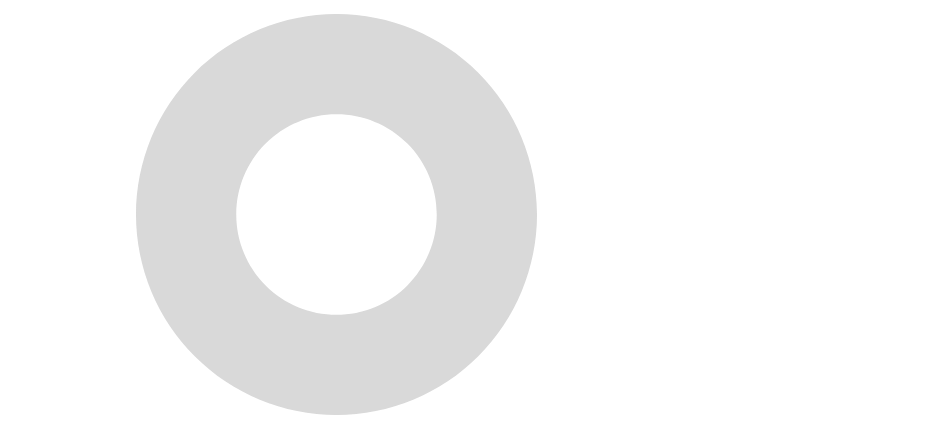
| Category | Series 0 |
|---|---|
| # of YES | 0 |
| # of NO | 0 |
| # of UNANSWERED | 275 |